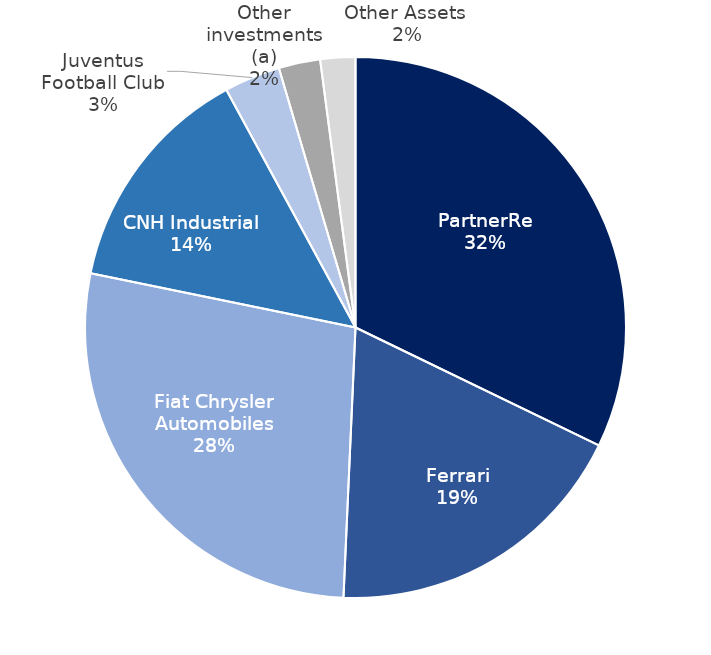
| Category | Series 0 |
|---|---|
| PartnerRe | 6681 |
| Ferrari | 3846 |
| Fiat Chrysler Automobiles | 5710 |
| CNH Industrial | 2878 |
| Juventus Football Club | 696 |
| Other investments (a) | 515 |
| Other Assets  | 434 |